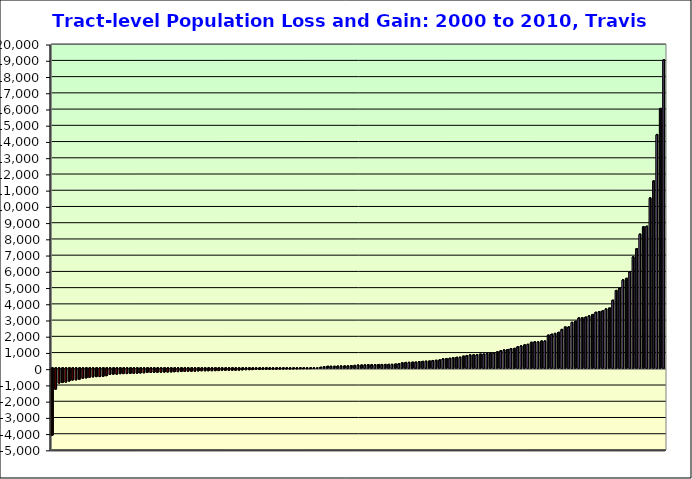
| Category | Series 0 |
|---|---|
| 0 | -4137 |
| 1 | -1294 |
| 2 | -920 |
| 3 | -885 |
| 4 | -858 |
| 5 | -796 |
| 6 | -734 |
| 7 | -722 |
| 8 | -686 |
| 9 | -622 |
| 10 | -603 |
| 11 | -565 |
| 12 | -539 |
| 13 | -521 |
| 14 | -520 |
| 15 | -507 |
| 16 | -465 |
| 17 | -389 |
| 18 | -370 |
| 19 | -369 |
| 20 | -340 |
| 21 | -335 |
| 22 | -334 |
| 23 | -323 |
| 24 | -314 |
| 25 | -310 |
| 26 | -298 |
| 27 | -289 |
| 28 | -261 |
| 29 | -258 |
| 30 | -257 |
| 31 | -253 |
| 32 | -247 |
| 33 | -244 |
| 34 | -239 |
| 35 | -233 |
| 36 | -223 |
| 37 | -215 |
| 38 | -204 |
| 39 | -197 |
| 40 | -189 |
| 41 | -189 |
| 42 | -187 |
| 43 | -171 |
| 44 | -163 |
| 45 | -163 |
| 46 | -161 |
| 47 | -158 |
| 48 | -151 |
| 49 | -148 |
| 50 | -135 |
| 51 | -132 |
| 52 | -130 |
| 53 | -130 |
| 54 | -126 |
| 55 | -123 |
| 56 | -108 |
| 57 | -96 |
| 58 | -91 |
| 59 | -89 |
| 60 | -79 |
| 61 | -79 |
| 62 | -71 |
| 63 | -70 |
| 64 | -67 |
| 65 | -66 |
| 66 | -63 |
| 67 | -55 |
| 68 | -54 |
| 69 | -50 |
| 70 | -49 |
| 71 | -47 |
| 72 | -44 |
| 73 | -33 |
| 74 | -33 |
| 75 | -33 |
| 76 | -29 |
| 77 | -1 |
| 78 | 0 |
| 79 | 37 |
| 80 | 80 |
| 81 | 97 |
| 82 | 99 |
| 83 | 99 |
| 84 | 107 |
| 85 | 115 |
| 86 | 116 |
| 87 | 119 |
| 88 | 137 |
| 89 | 151 |
| 90 | 172 |
| 91 | 173 |
| 92 | 182 |
| 93 | 192 |
| 94 | 194 |
| 95 | 199 |
| 96 | 203 |
| 97 | 208 |
| 98 | 211 |
| 99 | 215 |
| 100 | 220 |
| 101 | 233 |
| 102 | 254 |
| 103 | 311 |
| 104 | 332 |
| 105 | 341 |
| 106 | 352 |
| 107 | 353 |
| 108 | 385 |
| 109 | 398 |
| 110 | 412 |
| 111 | 422 |
| 112 | 451 |
| 113 | 471 |
| 114 | 487 |
| 115 | 560 |
| 116 | 569 |
| 117 | 590 |
| 118 | 629 |
| 119 | 649 |
| 120 | 659 |
| 121 | 725 |
| 122 | 754 |
| 123 | 800 |
| 124 | 802 |
| 125 | 811 |
| 126 | 849 |
| 127 | 849 |
| 128 | 887 |
| 129 | 900 |
| 130 | 925 |
| 131 | 987 |
| 132 | 1054 |
| 133 | 1103 |
| 134 | 1128 |
| 135 | 1188 |
| 136 | 1203 |
| 137 | 1297 |
| 138 | 1352 |
| 139 | 1414 |
| 140 | 1452 |
| 141 | 1579 |
| 142 | 1603 |
| 143 | 1604 |
| 144 | 1654 |
| 145 | 1654 |
| 146 | 2018 |
| 147 | 2072 |
| 148 | 2126 |
| 149 | 2188 |
| 150 | 2368 |
| 151 | 2518 |
| 152 | 2520 |
| 153 | 2808 |
| 154 | 2874 |
| 155 | 3080 |
| 156 | 3084 |
| 157 | 3126 |
| 158 | 3200 |
| 159 | 3289 |
| 160 | 3424 |
| 161 | 3471 |
| 162 | 3509 |
| 163 | 3628 |
| 164 | 3688 |
| 165 | 4168 |
| 166 | 4774 |
| 167 | 4904 |
| 168 | 5424 |
| 169 | 5518 |
| 170 | 5922 |
| 171 | 6848 |
| 172 | 7338 |
| 173 | 8239 |
| 174 | 8691 |
| 175 | 8724 |
| 176 | 10470 |
| 177 | 11516 |
| 178 | 14379 |
| 179 | 15983 |
| 180 | 18978 |